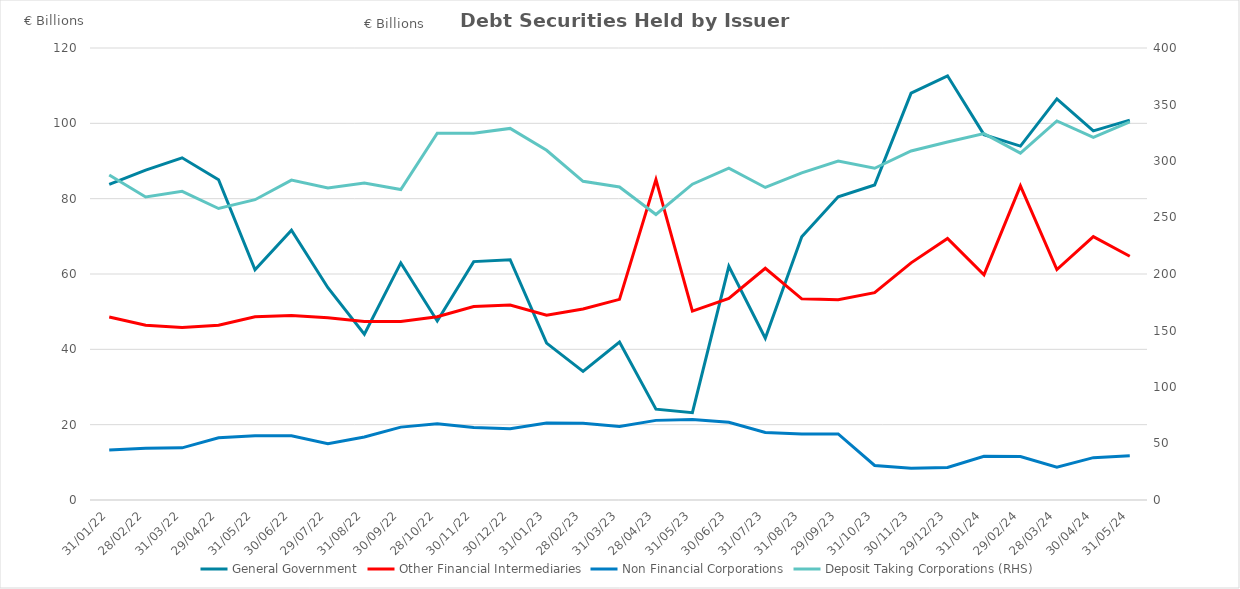
| Category | General Government | Other Financial Intermediaries | Non Financial Corporations |
|---|---|---|---|
| 2022-01-31 | 83.795 | 48.578 | 13.243 |
| 2022-02-28 | 87.582 | 46.39 | 13.771 |
| 2022-03-31 | 90.84 | 45.781 | 13.841 |
| 2022-04-29 | 85.033 | 46.398 | 16.497 |
| 2022-05-31 | 61.12 | 48.621 | 17.055 |
| 2022-06-30 | 71.613 | 48.983 | 17.08 |
| 2022-07-29 | 56.366 | 48.41 | 14.973 |
| 2022-08-31 | 44.033 | 47.374 | 16.747 |
| 2022-09-30 | 62.942 | 47.368 | 19.35 |
| 2022-10-28 | 47.526 | 48.643 | 20.217 |
| 2022-11-30 | 63.288 | 51.388 | 19.222 |
| 2022-12-30 | 63.785 | 51.765 | 18.912 |
| 2023-01-31 | 41.639 | 49.074 | 20.453 |
| 2023-02-28 | 34.164 | 50.702 | 20.392 |
| 2023-03-31 | 41.933 | 53.268 | 19.501 |
| 2023-04-28 | 24.128 | 85.071 | 21.14 |
| 2023-05-31 | 23.19 | 50.155 | 21.391 |
| 2023-06-30 | 62.05 | 53.548 | 20.652 |
| 2023-07-31 | 42.972 | 61.521 | 17.919 |
| 2023-08-31 | 69.911 | 53.397 | 17.544 |
| 2023-09-29 | 80.515 | 53.164 | 17.541 |
| 2023-10-31 | 83.624 | 55.054 | 9.176 |
| 2023-11-30 | 108.02 | 62.96 | 8.423 |
| 2023-12-29 | 112.617 | 69.449 | 8.623 |
| 2024-01-31 | 96.992 | 59.796 | 11.614 |
| 2024-02-29 | 93.958 | 83.378 | 11.546 |
| 2024-03-28 | 106.498 | 61.175 | 8.69 |
| 2024-04-30 | 97.998 | 69.905 | 11.238 |
| 2024-05-31 | 100.851 | 64.712 | 11.757 |